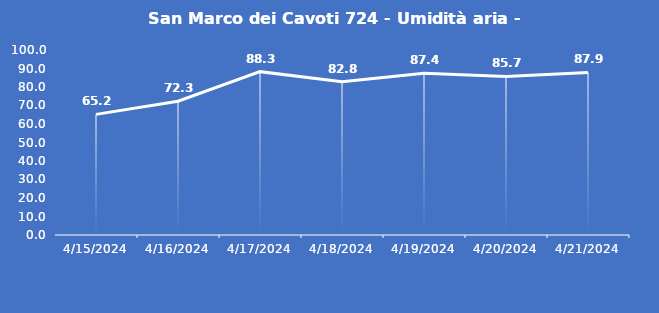
| Category | San Marco dei Cavoti 724 - Umidità aria - Grezzo (%) |
|---|---|
| 4/15/24 | 65.2 |
| 4/16/24 | 72.3 |
| 4/17/24 | 88.3 |
| 4/18/24 | 82.8 |
| 4/19/24 | 87.4 |
| 4/20/24 | 85.7 |
| 4/21/24 | 87.9 |